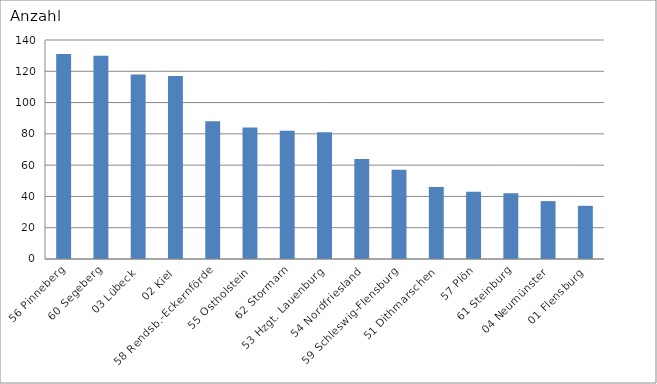
| Category | 56 Pinneberg 60 Segeberg 03 Lübeck 02 Kiel 58 Rendsb.-Eckernförde 55 Ostholstein 62 Stormarn 53 Hzgt. Lauenburg 54 Nordfriesland 59 Schleswig-Flensburg 51 Dithmarschen 57 Plön 61 Steinburg 04 Neumünster 01 Flensburg |
|---|---|
| 56 Pinneberg | 131 |
| 60 Segeberg | 130 |
| 03 Lübeck | 118 |
| 02 Kiel | 117 |
| 58 Rendsb.-Eckernförde | 88 |
| 55 Ostholstein | 84 |
| 62 Stormarn | 82 |
| 53 Hzgt. Lauenburg | 81 |
| 54 Nordfriesland | 64 |
| 59 Schleswig-Flensburg | 57 |
| 51 Dithmarschen | 46 |
| 57 Plön | 43 |
| 61 Steinburg | 42 |
| 04 Neumünster | 37 |
| 01 Flensburg | 34 |